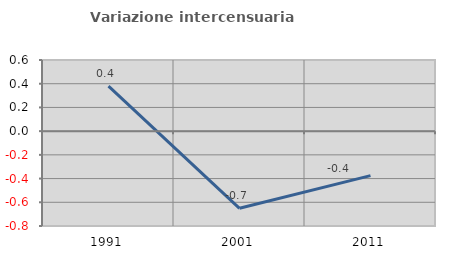
| Category | Variazione intercensuaria annua |
|---|---|
| 1991.0 | 0.38 |
| 2001.0 | -0.651 |
| 2011.0 | -0.375 |